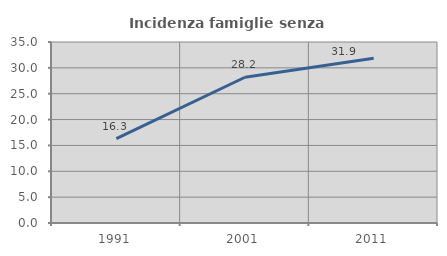
| Category | Incidenza famiglie senza nuclei |
|---|---|
| 1991.0 | 16.3 |
| 2001.0 | 28.185 |
| 2011.0 | 31.868 |